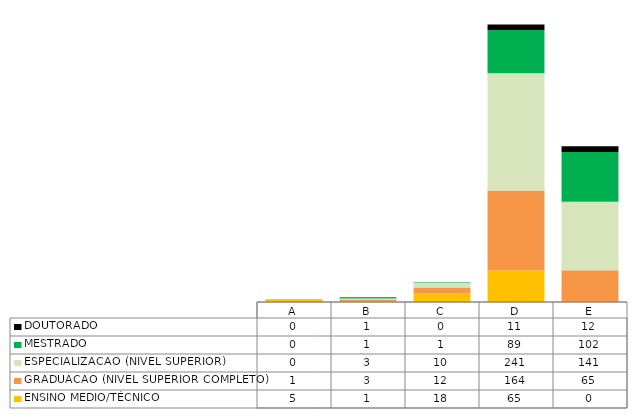
| Category | ENSINO MEDIO/TÉCNICO | GRADUACAO (NIVEL SUPERIOR COMPLETO) | ESPECIALIZACAO (NIVEL SUPERIOR)   | MESTRADO | DOUTORADO                             |
|---|---|---|---|---|---|
| A | 5 | 1 | 0 | 0 | 0 |
| B | 1 | 3 | 3 | 1 | 1 |
| C | 18 | 12 | 10 | 1 | 0 |
| D | 65 | 164 | 241 | 89 | 11 |
| E | 0 | 65 | 141 | 102 | 12 |